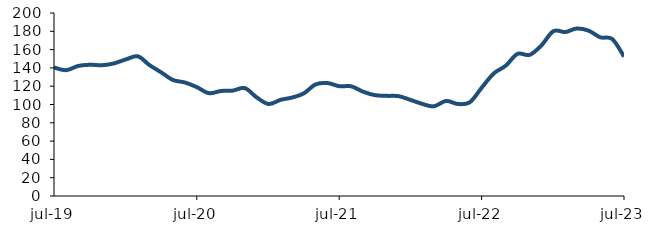
| Category | Series 0 |
|---|---|
| 2019-07-01 | 140.452 |
| 2019-08-01 | 137.511 |
| 2019-09-01 | 142.134 |
| 2019-10-01 | 143.438 |
| 2019-11-01 | 142.938 |
| 2019-12-01 | 144.831 |
| 2020-01-01 | 149.242 |
| 2020-02-01 | 152.669 |
| 2020-03-01 | 143.292 |
| 2020-04-01 | 135.035 |
| 2020-05-01 | 126.788 |
| 2020-06-01 | 124.002 |
| 2020-07-01 | 118.983 |
| 2020-08-01 | 112.386 |
| 2020-09-01 | 114.763 |
| 2020-10-01 | 115.159 |
| 2020-11-01 | 117.935 |
| 2020-12-01 | 107.927 |
| 2021-01-01 | 100.528 |
| 2021-02-01 | 105.144 |
| 2021-03-01 | 107.453 |
| 2021-04-01 | 112.047 |
| 2021-05-01 | 121.818 |
| 2021-06-01 | 123.47 |
| 2021-07-01 | 119.987 |
| 2021-08-01 | 119.848 |
| 2021-09-01 | 113.862 |
| 2021-10-01 | 110.18 |
| 2021-11-01 | 109.442 |
| 2021-12-01 | 109.08 |
| 2022-01-01 | 104.823 |
| 2022-02-01 | 100.399 |
| 2022-03-01 | 98.015 |
| 2022-04-01 | 103.921 |
| 2022-05-01 | 100.574 |
| 2022-06-01 | 102.532 |
| 2022-07-01 | 118.21 |
| 2022-08-01 | 133.857 |
| 2022-09-01 | 142.486 |
| 2022-10-01 | 155.309 |
| 2022-11-01 | 154.196 |
| 2022-12-01 | 164.427 |
| 2023-01-01 | 180.099 |
| 2023-02-01 | 179.195 |
| 2023-03-01 | 183.012 |
| 2023-04-01 | 180.771 |
| 2023-05-01 | 173.459 |
| 2023-06-01 | 171.503 |
| 2023-07-01 | 152.371 |